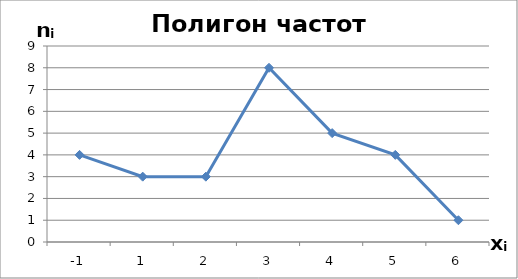
| Category | Series 0 |
|---|---|
| -1.0 | 4 |
| 1.0 | 3 |
| 2.0 | 3 |
| 3.0 | 8 |
| 4.0 | 5 |
| 5.0 | 4 |
| 6.0 | 1 |